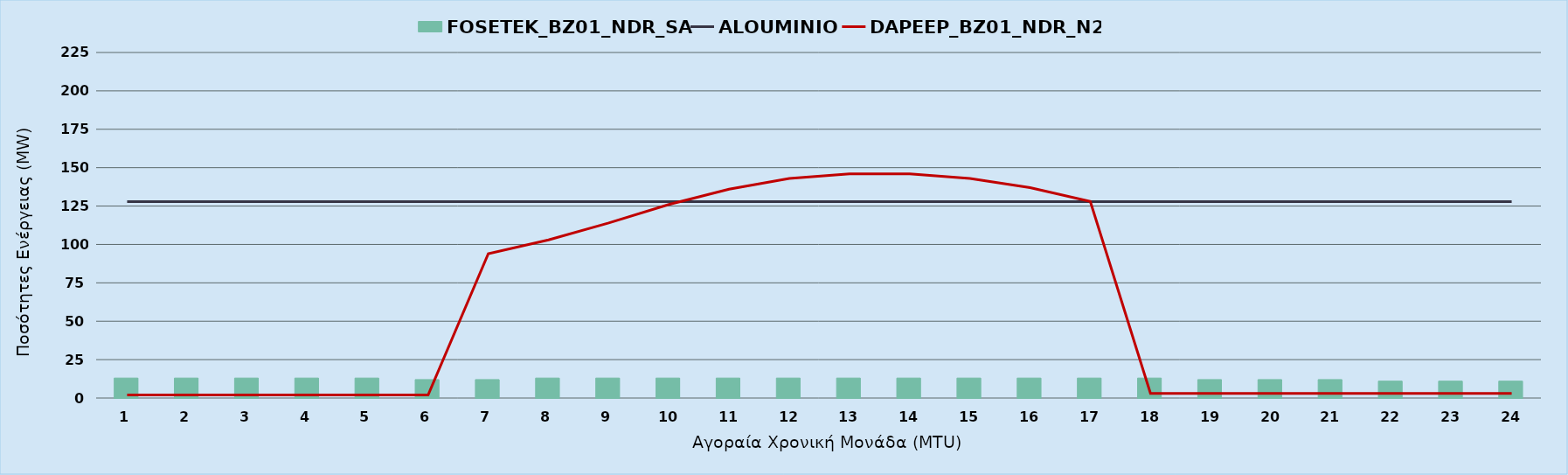
| Category | FOSETEK_BZ01_NDR_SA |
|---|---|
| 0 | 13 |
| 1 | 13 |
| 2 | 13 |
| 3 | 13 |
| 4 | 13 |
| 5 | 12 |
| 6 | 12 |
| 7 | 13 |
| 8 | 13 |
| 9 | 13 |
| 10 | 13 |
| 11 | 13 |
| 12 | 13 |
| 13 | 13 |
| 14 | 13 |
| 15 | 13 |
| 16 | 13 |
| 17 | 13 |
| 18 | 12 |
| 19 | 12 |
| 20 | 12 |
| 21 | 11 |
| 22 | 11 |
| 23 | 11 |